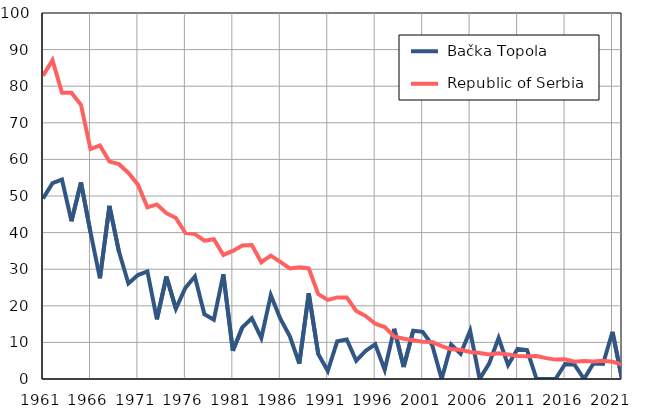
| Category |  Bačka Topola |  Republic of Serbia |
|---|---|---|
| 1961.0 | 49.3 | 82.9 |
| 1962.0 | 53.5 | 87.1 |
| 1963.0 | 54.5 | 78.2 |
| 1964.0 | 43.1 | 78.2 |
| 1965.0 | 53.7 | 74.9 |
| 1966.0 | 40.1 | 62.8 |
| 1967.0 | 27.5 | 63.8 |
| 1968.0 | 47.3 | 59.4 |
| 1969.0 | 34.8 | 58.7 |
| 1970.0 | 26.1 | 56.3 |
| 1971.0 | 28.4 | 53.1 |
| 1972.0 | 29.4 | 46.9 |
| 1973.0 | 16.3 | 47.7 |
| 1974.0 | 28 | 45.3 |
| 1975.0 | 19.2 | 44 |
| 1976.0 | 24.9 | 39.9 |
| 1977.0 | 28 | 39.6 |
| 1978.0 | 17.7 | 37.8 |
| 1979.0 | 16.2 | 38.2 |
| 1980.0 | 28.6 | 33.9 |
| 1981.0 | 7.7 | 35 |
| 1982.0 | 14.1 | 36.5 |
| 1983.0 | 16.6 | 36.6 |
| 1984.0 | 11.2 | 31.9 |
| 1985.0 | 22.9 | 33.7 |
| 1986.0 | 16.5 | 32 |
| 1987.0 | 11.7 | 30.2 |
| 1988.0 | 4.2 | 30.5 |
| 1989.0 | 23.4 | 30.2 |
| 1990.0 | 6.8 | 23.2 |
| 1991.0 | 2.2 | 21.6 |
| 1992.0 | 10.3 | 22.3 |
| 1993.0 | 10.8 | 22.3 |
| 1994.0 | 5 | 18.6 |
| 1995.0 | 7.7 | 17.2 |
| 1996.0 | 9.5 | 15.1 |
| 1997.0 | 2.5 | 14.2 |
| 1998.0 | 13.7 | 11.6 |
| 1999.0 | 3.3 | 11 |
| 2000.0 | 13.2 | 10.6 |
| 2001.0 | 12.9 | 10.2 |
| 2002.0 | 9.3 | 10.1 |
| 2003.0 | 0 | 9 |
| 2004.0 | 9.4 | 8.1 |
| 2005.0 | 6.9 | 8 |
| 2006.0 | 13.2 | 7.4 |
| 2007.0 | 0 | 7.1 |
| 2008.0 | 4.2 | 6.7 |
| 2009.0 | 11.2 | 7 |
| 2010.0 | 3.8 | 6.7 |
| 2011.0 | 8.2 | 6.3 |
| 2012.0 | 7.9 | 6.2 |
| 2013.0 | 0 | 6.3 |
| 2014.0 | 0 | 5.7 |
| 2015.0 | 0 | 5.3 |
| 2016.0 | 4.1 | 5.4 |
| 2017.0 | 3.9 | 4.7 |
| 2018.0 | 0 | 4.9 |
| 2019.0 | 4.3 | 4.8 |
| 2020.0 | 4.1 | 5 |
| 2021.0 | 12.9 | 4.7 |
| 2022.0 | 0 | 4 |